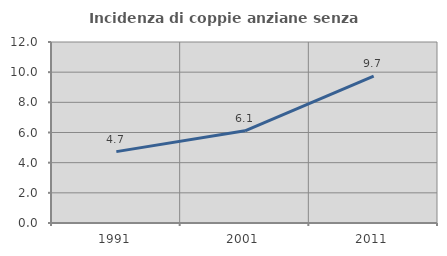
| Category | Incidenza di coppie anziane senza figli  |
|---|---|
| 1991.0 | 4.731 |
| 2001.0 | 6.11 |
| 2011.0 | 9.734 |